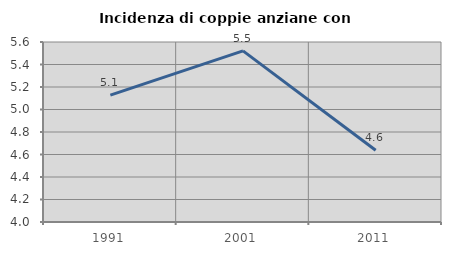
| Category | Incidenza di coppie anziane con figli |
|---|---|
| 1991.0 | 5.128 |
| 2001.0 | 5.521 |
| 2011.0 | 4.638 |